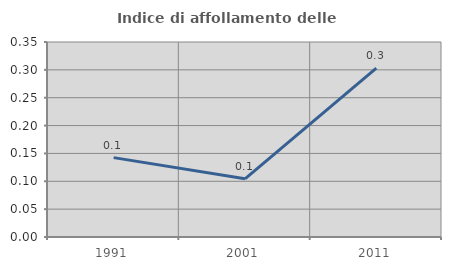
| Category | Indice di affollamento delle abitazioni  |
|---|---|
| 1991.0 | 0.142 |
| 2001.0 | 0.104 |
| 2011.0 | 0.303 |